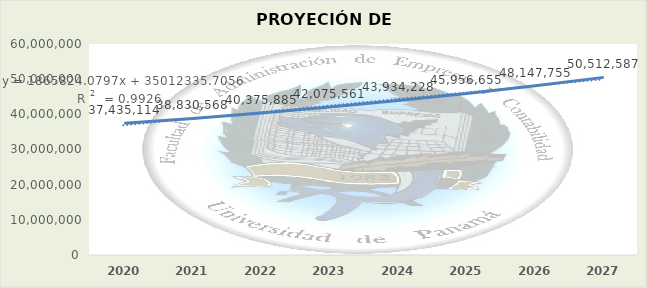
| Category | Series 0 |
|---|---|
| 2020.0 | 37435114.23 |
| 2021.0 | 38830567.657 |
| 2022.0 | 40375884.687 |
| 2023.0 | 42075561.227 |
| 2024.0 | 43934228.064 |
| 2025.0 | 45956654.906 |
| 2026.0 | 48147754.553 |
| 2027.0 | 50512587.19 |